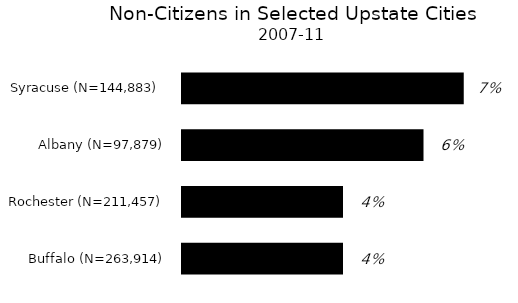
| Category | Series 0 |
|---|---|
| Buffalo (N=263,914) | 0.04 |
| Rochester (N=211,457) | 0.04 |
| Albany (N=97,879) | 0.06 |
| Syracuse (N=144,883)  | 0.07 |